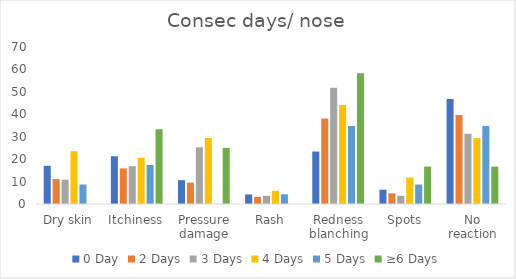
| Category | 0 Day | 2 Days | 3 Days | 4 Days | 5 Days | ≥6 Days |
|---|---|---|---|---|---|---|
| Dry skin | 17.021 | 11.111 | 10.843 | 23.529 | 8.696 | 0 |
| Itchiness | 21.277 | 15.873 | 16.867 | 20.588 | 17.391 | 33.333 |
| Pressure damage | 10.638 | 9.524 | 25.301 | 29.412 | 0 | 25 |
| Rash | 4.255 | 3.175 | 3.614 | 5.882 | 4.348 | 0 |
| Redness blanching | 23.404 | 38.095 | 51.807 | 44.118 | 34.783 | 58.333 |
| Spots | 6.383 | 4.762 | 3.614 | 11.765 | 8.696 | 16.667 |
| No reaction | 46.809 | 39.683 | 31.325 | 29.412 | 34.783 | 16.667 |